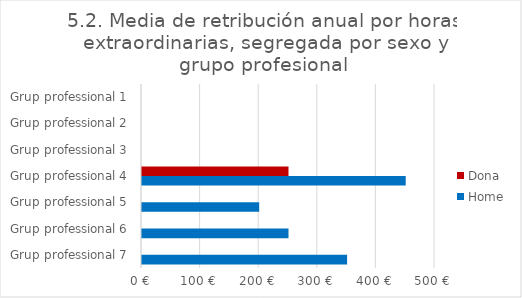
| Category | Dona | Home |
|---|---|---|
| Grup professional 1 | 0 | 0 |
| Grup professional 2 | 0 | 0 |
| Grup professional 3 | 0 | 0 |
| Grup professional 4 | 250 | 450 |
| Grup professional 5 | 0 | 200 |
| Grup professional 6 | 0 | 250 |
| Grup professional 7 | 0 | 350 |